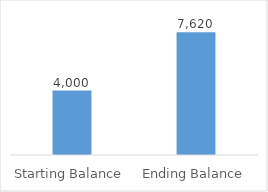
| Category | Series 0 |
|---|---|
| Starting Balance | 4000 |
| Ending Balance | 7620 |